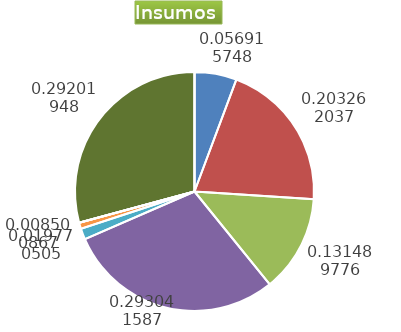
| Category | Series 0 |
|---|---|
| Control arvenses | 2447529.333 |
| Control fitosanitario | 8740811 |
| Cosecha y beneficio | 5654411.906 |
| Fertilización | 12601571.667 |
| Instalación | 635171.192 |
| Otros | 365560 |
| Podas | 0 |
| Riego | 0 |
| Transporte | 12557618.333 |
| Tutorado | 0 |